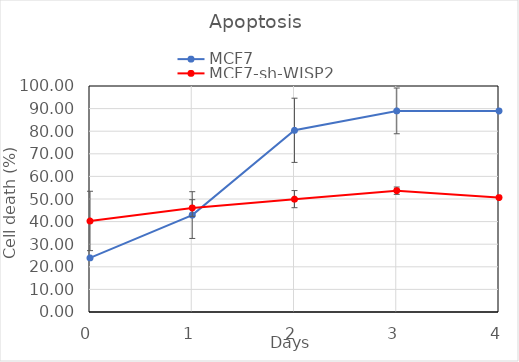
| Category | MCF7 | MCF7-sh-WISP2 |
|---|---|---|
| 0.0 | 23.95 | 40.29 |
| 1.0 | 42.89 | 46.01 |
| 2.0 | 80.395 | 49.94 |
| 3.0 | 88.985 | 53.675 |
| 4.0 | 88.93 | 50.605 |